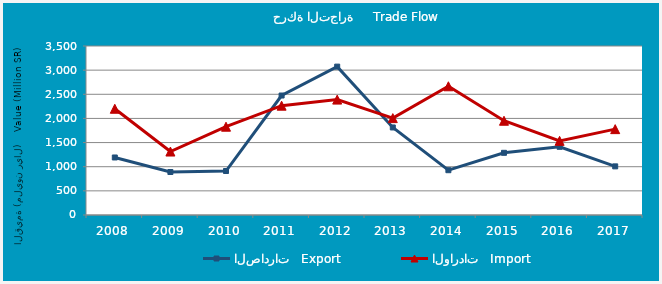
| Category | الصادرات   Export | الواردات   Import |
|---|---|---|
| 2008.0 | 1191236843 | 2200134471 |
| 2009.0 | 890365844 | 1314200144 |
| 2010.0 | 910924649 | 1828920175 |
| 2011.0 | 2474210457 | 2263900879 |
| 2012.0 | 3073028009 | 2389752422 |
| 2013.0 | 1812872990 | 2006569959 |
| 2014.0 | 927654520 | 2665625467 |
| 2015.0 | 1287826403 | 1951924722 |
| 2016.0 | 1412092860 | 1535659434 |
| 2017.0 | 1007157336 | 1778252169 |